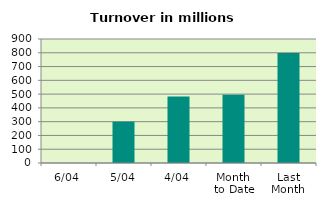
| Category | Series 0 |
|---|---|
| 6/04 | 0 |
| 5/04 | 299.961 |
| 4/04 | 481.902 |
| Month 
to Date | 495.141 |
| Last
Month | 798.115 |